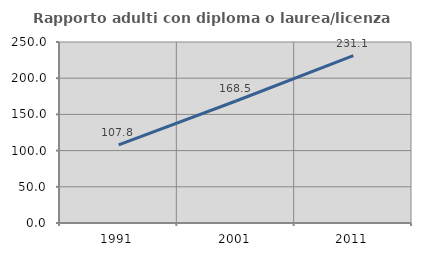
| Category | Rapporto adulti con diploma o laurea/licenza media  |
|---|---|
| 1991.0 | 107.781 |
| 2001.0 | 168.528 |
| 2011.0 | 231.053 |